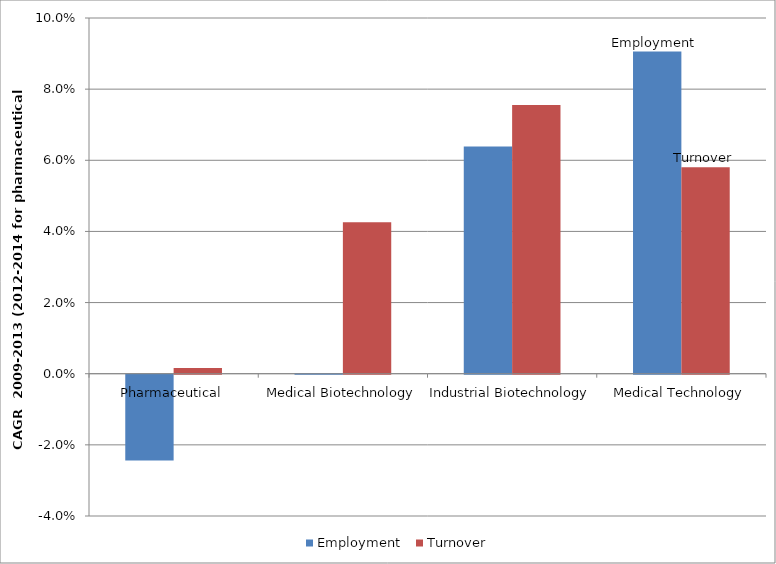
| Category | Employment  | Turnover |
|---|---|---|
| Pharmaceutical | -0.024 | 0.002 |
| Medical Biotechnology | 0 | 0.043 |
| Industrial Biotechnology | 0.064 | 0.076 |
| Medical Technology | 0.091 | 0.058 |